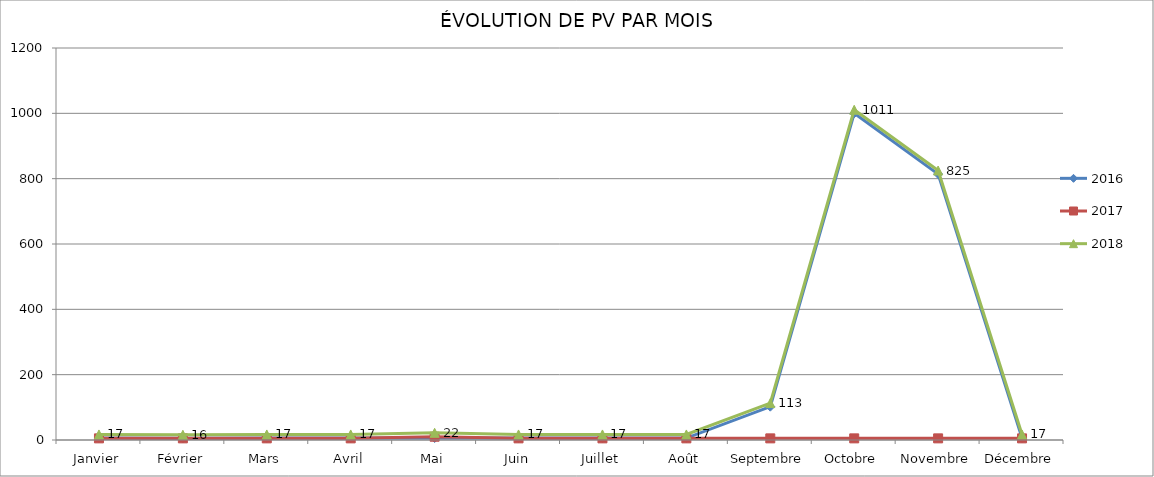
| Category | 2016 | 2017 | 2018 |
|---|---|---|---|
| Janvier | 6 | 5 | 17 |
| Février | 5 | 5 | 16 |
| Mars | 6 | 5 | 17 |
| Avril | 6 | 5 | 17 |
| Mai | 6 | 10 | 22 |
| Juin | 6 | 5 | 17 |
| Juillet | 6 | 5 | 17 |
| Août | 6 | 5 | 17 |
| Septembre | 102 | 5 | 113 |
| Octobre | 1000 | 5 | 1011 |
| Novembre | 814 | 5 | 825 |
| Décembre | 6 | 5 | 17 |